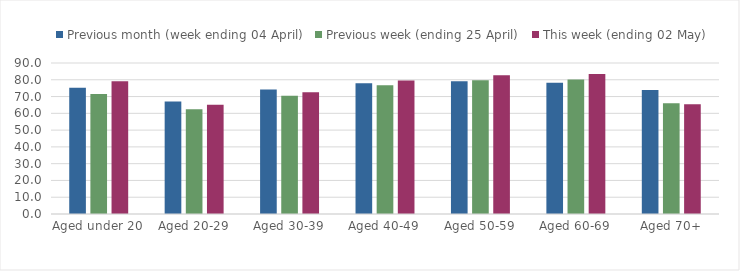
| Category | Previous month (week ending 04 April) | Previous week (ending 25 April) | This week (ending 02 May) |
|---|---|---|---|
| Aged under 20 | 75.319 | 71.526 | 79.108 |
| Aged 20-29 | 67.004 | 62.467 | 65.179 |
| Aged 30-39 | 74.178 | 70.471 | 72.618 |
| Aged 40-49 | 78.001 | 76.791 | 79.58 |
| Aged 50-59 | 79.127 | 79.66 | 82.673 |
| Aged 60-69 | 78.174 | 80.163 | 83.51 |
| Aged 70+ | 73.925 | 66.076 | 65.393 |